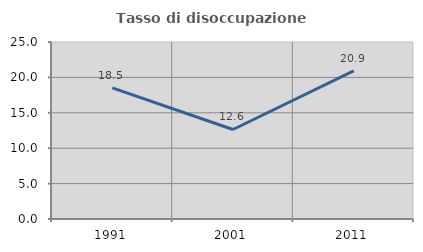
| Category | Tasso di disoccupazione giovanile  |
|---|---|
| 1991.0 | 18.519 |
| 2001.0 | 12.644 |
| 2011.0 | 20.93 |